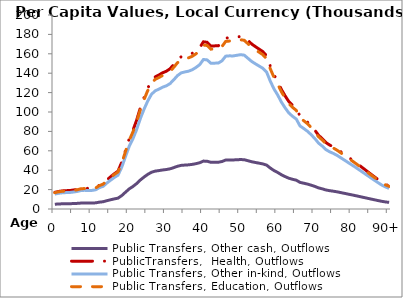
| Category | Public Transfers, Other cash, Outflows | PublicTransfers,  Health, Outflows | Public Transfers, Other in-kind, Outflows | Public Transfers, Education, Outflows |
|---|---|---|---|---|
| 0 | 4918.53 | 17166.108 | 15349.861 | 16833.759 |
|  | 5179.474 | 18076.825 | 16164.219 | 17726.844 |
| 2 | 5343.744 | 18650.142 | 16676.878 | 18289.062 |
| 3 | 5417.795 | 18908.587 | 16907.978 | 18542.502 |
| 4 | 5454.712 | 19037.43 | 17023.188 | 18668.851 |
| 5 | 5605.368 | 19563.233 | 17493.359 | 19184.474 |
| 6 | 5792.015 | 20214.648 | 18075.852 | 19823.277 |
| 7 | 6091.495 | 21259.859 | 19010.475 | 20848.252 |
| 8 | 6164.421 | 21514.378 | 19238.065 | 21097.843 |
| 9 | 6080.017 | 21219.8 | 18974.655 | 20808.969 |
| 10 | 6143.717 | 21442.117 | 19173.449 | 21026.982 |
| 11 | 6352.811 | 22171.873 | 19825.994 | 21742.609 |
| 12 | 7058.523 | 24634.873 | 22028.399 | 24157.924 |
| 13 | 7488.42 | 26135.251 | 23370.03 | 25629.253 |
| 14 | 8577.798 | 29937.277 | 26769.785 | 29357.669 |
| 15 | 9510.018 | 33190.806 | 29679.077 | 32548.208 |
| 16 | 10408.437 | 36326.368 | 32482.883 | 35623.063 |
| 17 | 11161.549 | 38954.799 | 34833.215 | 38200.605 |
| 18 | 13785.347 | 48112.084 | 43021.62 | 47180.599 |
| 19 | 17263.094 | 60249.733 | 53875.054 | 59083.253 |
| 20 | 20661.952 | 72112.046 | 64482.283 | 70715.903 |
| 21 | 23162.742 | 80840.026 | 72286.806 | 79274.903 |
| 22 | 26172.52 | 91344.416 | 81679.79 | 89575.92 |
| 23 | 29833.474 | 104121.48 | 93104.976 | 102105.61 |
| 24 | 32927.56 | 114920.11 | 102761.07 | 112695.17 |
| 25 | 35665.096 | 124474.36 | 111304.434 | 122064.44 |
| 26 | 37863.907 | 132148.4 | 118166.533 | 129589.91 |
| 27 | 39036.306 | 136240.17 | 121825.384 | 133602.46 |
| 28 | 39585.609 | 138157.29 | 123539.661 | 135482.46 |
| 29 | 40231.611 | 140411.9 | 125555.719 | 137693.42 |
| 30 | 40688.462 | 142006.35 | 126981.468 | 139257 |
| 31 | 41408.799 | 144520.38 | 129229.511 | 141722.36 |
| 32 | 42661.893 | 148893.79 | 133140.197 | 146011.1 |
| 33 | 44049.621 | 153737.09 | 137471.049 | 150760.63 |
| 34 | 44962.033 | 156921.49 | 140318.527 | 153883.38 |
| 35 | 45275.784 | 158016.51 | 141297.686 | 154957.19 |
| 36 | 45532.16 | 158911.28 | 142097.79 | 155834.64 |
| 37 | 46005.777 | 160564.25 | 143575.863 | 157455.61 |
| 38 | 46753.03 | 163172.22 | 145907.91 | 160013.09 |
| 39 | 47681.33 | 166412.08 | 148804.97 | 163190.22 |
| 40 | 49386.604 | 172363.64 | 154126.826 | 169026.55 |
| 41 | 49249.408 | 171884.81 | 153698.662 | 168556.99 |
| 42 | 48153.809 | 168061.07 | 150279.491 | 164807.29 |
| 43 | 48182.954 | 168162.78 | 150370.446 | 164907.03 |
| 44 | 48202.857 | 168232.25 | 150432.563 | 164975.15 |
| 45 | 48953.336 | 170851.49 | 152774.674 | 167543.68 |
| 46 | 50489.367 | 176212.38 | 157568.353 | 172800.77 |
| 47 | 50589.667 | 176562.43 | 157881.373 | 173144.05 |
| 48 | 50569.118 | 176490.71 | 157817.242 | 173073.72 |
| 49 | 50773.47 | 177203.92 | 158454.99 | 173773.12 |
| 50 | 50981.412 | 177929.66 | 159103.938 | 174484.81 |
| 51 | 50809.805 | 177330.73 | 158568.385 | 173897.47 |
| 52 | 49763.568 | 173679.27 | 155303.262 | 170316.71 |
| 53 | 48728.57 | 170067.04 | 152073.22 | 166774.42 |
| 54 | 47958.147 | 167378.19 | 149668.863 | 164137.62 |
| 55 | 47221.269 | 164806.42 | 147369.201 | 161615.65 |
| 56 | 46477.386 | 162210.2 | 145047.674 | 159069.69 |
| 57 | 45261.403 | 157966.32 | 141252.807 | 154907.97 |
| 58 | 42241.271 | 147425.79 | 131827.509 | 144571.51 |
| 59 | 39653.865 | 138395.51 | 123752.675 | 135716.07 |
| 60 | 37641.857 | 131373.42 | 117473.553 | 128829.94 |
| 61 | 35298.567 | 123195.13 | 110160.563 | 120809.98 |
| 62 | 33398.184 | 116562.63 | 104229.806 | 114305.89 |
| 63 | 31713.722 | 110683.71 | 98972.898 | 108540.79 |
| 64 | 30617.87 | 106859.09 | 95552.94 | 104790.22 |
| 65 | 29703.745 | 103668.71 | 92700.115 | 101661.6 |
| 66 | 27441.027 | 95771.62 | 85638.573 | 93917.41 |
| 67 | 26598.336 | 92830.552 | 83008.684 | 91033.283 |
| 68 | 25697.057 | 89685.012 | 80195.953 | 87948.644 |
| 69 | 24548.643 | 85676.94 | 76611.957 | 84018.17 |
| 70 | 23262.884 | 81189.531 | 72599.332 | 79617.641 |
| 71 | 21760.115 | 75944.733 | 67909.455 | 74474.386 |
| 72 | 20773.651 | 72501.886 | 64830.877 | 71098.196 |
| 73 | 19603.491 | 68417.924 | 61179.016 | 67093.302 |
| 74 | 18890.684 | 65930.164 | 58954.471 | 64653.707 |
| 75 | 18351.082 | 64046.905 | 57270.469 | 62806.909 |
| 76 | 17696.998 | 61764.096 | 55229.191 | 60568.297 |
| 77 | 16905.797 | 59002.733 | 52759.992 | 57860.396 |
| 78 | 16118.394 | 56254.625 | 50302.645 | 55165.493 |
| 79 | 15316.496 | 53455.933 | 47800.067 | 52420.986 |
| 80 | 14531.827 | 50717.366 | 45351.252 | 49735.44 |
| 81 | 13725.209 | 47902.2 | 42833.943 | 46974.777 |
| 82 | 12886.509 | 44975.06 | 40216.507 | 44104.31 |
| 83 | 12042.607 | 42029.768 | 37582.839 | 41216.04 |
| 84 | 11202.063 | 39096.196 | 34959.652 | 38339.264 |
| 85 | 10362.014 | 36164.347 | 32338.005 | 35464.179 |
| 86 | 9531.796 | 33266.815 | 29747.044 | 32622.744 |
| 87 | 8717.299 | 30424.149 | 27205.144 | 29835.114 |
| 88 | 7913.639 | 27619.303 | 24697.063 | 27084.573 |
| 89 | 7286.106 | 25429.158 | 22738.644 | 24936.83 |
| 90+ | 6816.352 | 23789.675 | 21272.626 | 23329.089 |